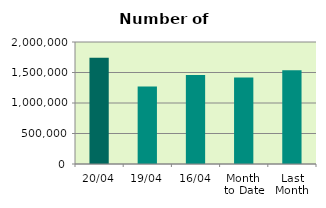
| Category | Series 0 |
|---|---|
| 20/04 | 1741634 |
| 19/04 | 1269680 |
| 16/04 | 1460802 |
| Month 
to Date | 1419511.667 |
| Last
Month | 1535393.739 |